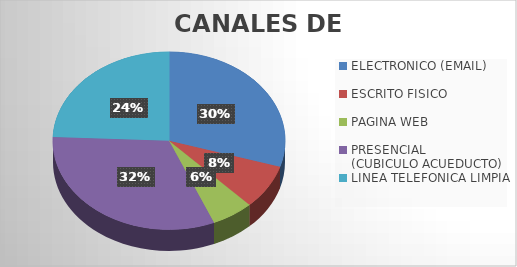
| Category | Series 0 |
|---|---|
| ELECTRONICO (EMAIL) | 357 |
| ESCRITO FISICO  | 97 |
| PAGINA WEB                               | 70 |
| PRESENCIAL                    (CUBICULO ACUEDUCTO) | 384 |
| LINEA TELEFONICA LIMPIA | 292 |